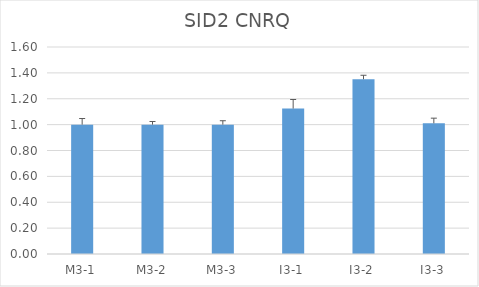
| Category | SID2 CNRQ |
|---|---|
| M3-1 | 1 |
| M3-2 | 1 |
| M3-3 | 1 |
| I3-1 | 1.124 |
| I3-2 | 1.351 |
| I3-3 | 1.01 |